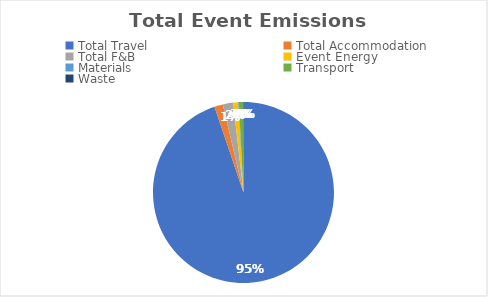
| Category | Series 0 |
|---|---|
| Total Travel | 52.56 |
| Total Accommodation | 0.85 |
| Total F&B | 1.02 |
| Event Energy | 0.48 |
| Materials | 0.07 |
| Transport | 0.41 |
| Waste | 0.05 |